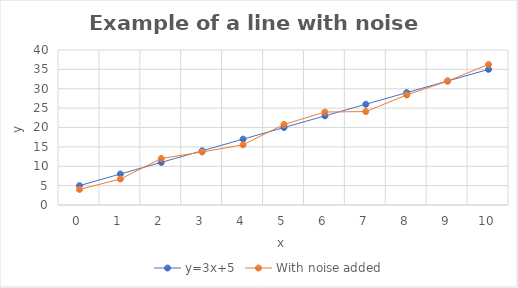
| Category | y=3x+5 | With noise added |
|---|---|---|
| 0.0 | 5 | 4.018 |
| 1.0 | 8 | 6.704 |
| 2.0 | 11 | 11.998 |
| 3.0 | 14 | 13.682 |
| 4.0 | 17 | 15.544 |
| 5.0 | 20 | 20.789 |
| 6.0 | 23 | 23.988 |
| 7.0 | 26 | 24.115 |
| 8.0 | 29 | 28.397 |
| 9.0 | 32 | 31.957 |
| 10.0 | 35 | 36.3 |